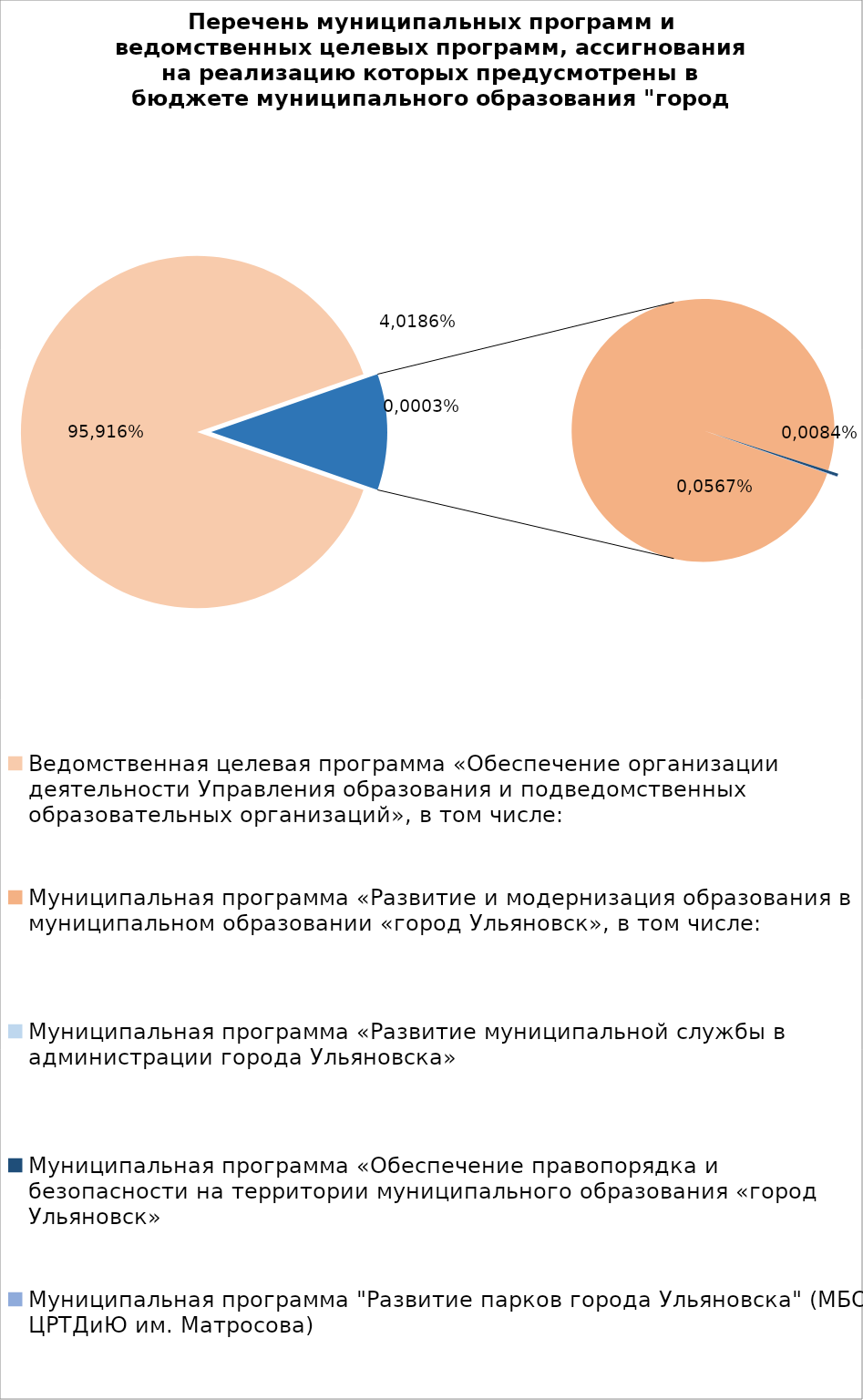
| Category | Series 0 |
|---|---|
| Ведомственная целевая программа «Обеспечение организации деятельности Управления образования и подведомственных образовательных организаций», в том числе: | 6697923.7 |
| Муниципальная программа «Развитие и модернизация образования в муниципальном образовании «город Ульяновск», в том числе: | 795386.4 |
| Муниципальная программа «Развитие муниципальной службы в администрации города Ульяновска» | 14.3 |
| Муниципальная программа «Обеспечение правопорядка и безопасности на территории муниципального образования «город Ульяновск» | 2700 |
| Муниципальная программа "Развитие парков города Ульяновска" (МБОУ ЦРТДиЮ им. Матросова) | 400 |